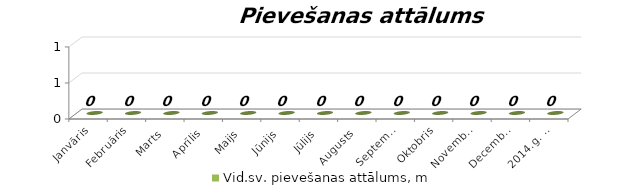
| Category | Vid.sv. pievešanas attālums, m |
|---|---|
| Janvāris | 0 |
| Februāris | 0 |
| Marts | 0 |
| Aprīlis | 0 |
| Maijs | 0 |
| Jūnijs | 0 |
| Jūlijs | 0 |
| Augusts | 0 |
| Septembris | 0 |
| Oktobris | 0 |
| Novembris | 0 |
| Decembris | 0 |
| 2014.g. kopā | 0 |